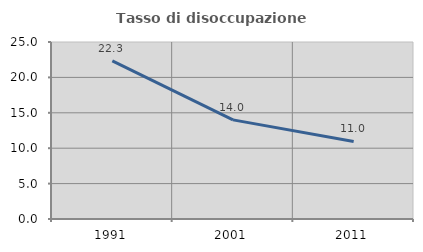
| Category | Tasso di disoccupazione giovanile  |
|---|---|
| 1991.0 | 22.33 |
| 2001.0 | 14 |
| 2011.0 | 10.959 |